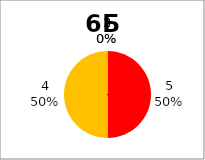
| Category | Series 0 |
|---|---|
| 5.0 | 6 |
| 4.0 | 6 |
| 3.0 | 0 |
| 2.0 | 0 |